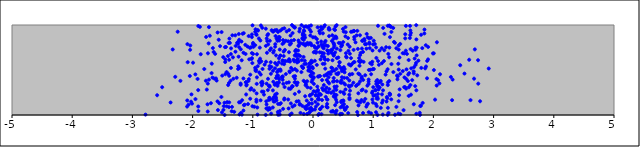
| Category | points |
|---|---|
| -0.11536172140889978 | 0.568 |
| 0.855340560258254 | 0.827 |
| 0.950376593433421 | 0.575 |
| -2.3654217001314772 | 0.139 |
| -0.9188085519647311 | 0.542 |
| 1.7925445229393047 | 0.104 |
| -0.3962743091543137 | 0.62 |
| 0.4827514001075617 | 0.516 |
| 2.0078775419024346 | 0.499 |
| 1.4906313874844983 | 0.687 |
| 0.229413308267703 | 0.089 |
| 1.299733297988685 | 0.174 |
| 0.9816180156502776 | 0.245 |
| 0.2290663632126302 | 0.389 |
| -1.5076938414311032 | 0.437 |
| -1.4354299441922942 | 0.477 |
| -0.493512844129369 | 0.347 |
| 0.11905940468164022 | 0.067 |
| -0.8036104463055107 | 0.56 |
| 0.8638495821112855 | 0.787 |
| 1.4173811658970017 | 0.016 |
| -1.695239620320689 | 0.131 |
| 0.6150114944620038 | 0.271 |
| 1.0090917165229216 | 0.826 |
| -0.3024135431161721 | 0.234 |
| -0.14083587335335235 | 0.888 |
| 1.3328299410901483 | 0.967 |
| -0.6283894157879573 | 0.227 |
| 1.8634917733704928 | 0.519 |
| -0.7447554629106268 | 0.058 |
| -0.1540404427648241 | 0.011 |
| -1.4905088370923636 | 0.642 |
| 0.3897195040649599 | 0.512 |
| 0.5305976975350095 | 0.056 |
| -1.6005800654296687 | 0.382 |
| -0.2729990534261706 | 0.15 |
| 0.3431523231334239 | 0.748 |
| -1.9068326993211508 | 0.277 |
| 0.8919075674239023 | 0.901 |
| 0.1297269422682934 | 0.226 |
| 1.0715161905887953 | 0.001 |
| 0.3144540680898693 | 0.823 |
| 0.09979983645594004 | 0.012 |
| 1.2055273532356274 | 0.448 |
| -2.0668161795774527 | 0.115 |
| 0.39399229132634517 | 0.318 |
| -1.637451032743872 | 0.404 |
| -1.2375084719498073 | 0.816 |
| 2.775246553585111 | 0.153 |
| -1.4567578296023571 | 0.618 |
| -0.05428214318970248 | 0.949 |
| -0.36726352069429513 | 0.129 |
| -0.6128458464107265 | 0.411 |
| 1.7052916728498895 | 0.725 |
| -0.2948752549511857 | 0.71 |
| 0.965690233938612 | 0.018 |
| -0.7446493147939428 | 0.784 |
| 0.09079423327969671 | 0.182 |
| -0.03739701206672574 | 0.795 |
| 0.6746534140835605 | 0.723 |
| 0.3076144245913257 | 0.719 |
| 0.17045094450077158 | 0.276 |
| -0.23729158090142377 | 0.771 |
| -0.5077637825059611 | 0.956 |
| 1.416662639511081 | 0.569 |
| 0.592947429764056 | 0.325 |
| -0.23954945366533575 | 0.767 |
| 1.5606696814219276 | 0.679 |
| 0.42346683080728376 | 0.468 |
| -1.1136013875597985 | 0.364 |
| -0.565676097437315 | 0.63 |
| -0.49818883439374595 | 0.832 |
| 0.1860750004171159 | 0.646 |
| -1.748240753640708 | 0.038 |
| -0.12287783613970404 | 0.33 |
| -0.8989563929704767 | 0.85 |
| -0.5523257429035029 | 0.045 |
| -1.611263220863023 | 0.406 |
| -0.8485586511439056 | 0.26 |
| 0.3425882755479801 | 0.848 |
| -0.9396232247876259 | 0.148 |
| 0.8108742677432819 | 0.424 |
| 0.524627232664681 | 0.474 |
| 1.4232181631729972 | 0.727 |
| 1.0499763745436805 | 0.372 |
| 0.5487009924934227 | 0.649 |
| 0.4729792911295574 | 0.385 |
| -0.2890499608500585 | 0.362 |
| 0.2506612368109682 | 0.464 |
| 0.5037959026280987 | 0.494 |
| 0.3947005808688955 | 0.141 |
| 0.24193768234937973 | 0.084 |
| 1.2782316736548003 | 0.865 |
| 0.6059959908328532 | 0.313 |
| -0.8704365943221051 | 0.163 |
| 1.8968619332324215 | 0.601 |
| 1.9109914056362323 | 0.618 |
| 1.0686088039595765 | 0.388 |
| 0.18840909640332093 | 0.437 |
| -0.47032570906938 | 0.598 |
| -1.3954701478435938 | 0.356 |
| 1.9118599101543197 | 0.757 |
| -1.1879964743984717 | 0.816 |
| 1.5187437734888452 | 0.418 |
| -0.913542339558246 | 0.938 |
| 0.12059355055421772 | 0.233 |
| -0.7031653131466147 | 0.586 |
| -0.7113163612693487 | 0.174 |
| -0.47535035608335985 | 0.184 |
| 0.132792798878695 | 0.977 |
| 1.7728537748569497 | 0.025 |
| -0.16952839372547324 | 0.858 |
| 0.8676345817348059 | 0.442 |
| 0.8686987402545592 | 0.179 |
| 0.029887238707689612 | 0.602 |
| -2.5056990865234745 | 0.309 |
| -0.7836495115470603 | 0.959 |
| 0.08001779421285615 | 0.119 |
| 1.6260380753652965 | 0.914 |
| 0.6396330073818568 | 0.329 |
| -0.3600729175718076 | 0.826 |
| 0.744756380228508 | 0.734 |
| -0.7340780543695571 | 0.167 |
| 0.3016331732355191 | 0.038 |
| -0.6020792045651033 | 0.237 |
| -0.5755650622314397 | 0.013 |
| -0.5346375320193157 | 0.131 |
| -0.5781360577551791 | 0.003 |
| -0.38238630235267923 | 0.003 |
| 0.30605923700554527 | 0.691 |
| -0.9378483628061289 | 0.89 |
| -0.33960009743820585 | 0.91 |
| 0.251572280414865 | 0.709 |
| -0.03411026291756869 | 0.926 |
| 1.2433906601676243 | 0.361 |
| -1.2017069204903628 | 0.35 |
| 0.2762548973997365 | 0.95 |
| -1.4337291907233363 | 0.096 |
| -1.025541668641777 | 0.297 |
| 0.2170081126896788 | 0.772 |
| -0.030941954401868976 | 0.477 |
| 1.5758301334003741 | 0.377 |
| 1.4505038069704428 | 0.009 |
| 1.0435942979064317 | 0.121 |
| -0.1687540861729424 | 0.896 |
| 0.24877031054929422 | 0.613 |
| -0.5765976322692907 | 0.414 |
| 0.30510692064172584 | 0.526 |
| -0.3961830401980091 | 0.944 |
| 0.014091697885460164 | 0.346 |
| -1.114114675839632 | 0.363 |
| -1.0658793220031528 | 0.399 |
| -0.29685529254652643 | 0.432 |
| 1.2423831419729092 | 0.332 |
| -1.7138373717556572 | 0.881 |
| -1.2075637460352322 | 0.142 |
| 0.1697603179341991 | 0.763 |
| -1.7750621634563988 | 0.867 |
| 0.16081281060495378 | 0.684 |
| 1.2142121458834314 | 0.753 |
| -0.30033399149122086 | 0.404 |
| -0.18675919740164204 | 0.54 |
| 1.068599934577989 | 0.318 |
| -1.169563646371384 | 0.903 |
| 1.188048088525715 | 0.901 |
| 0.07630100883736457 | 0.803 |
| -1.5191686653465917 | 0.921 |
| -0.7168326939125436 | 0.065 |
| 0.762205421555274 | 0.598 |
| 1.1841943182652317 | 0.72 |
| -0.38527386471606295 | 0.475 |
| -0.7801293024914244 | 0.592 |
| 0.43992175131592504 | 0.588 |
| -0.9483262064347695 | 0.506 |
| -1.6809006983068313 | 0.57 |
| 0.3410840524451544 | 0.799 |
| -0.3475941795915851 | 0.314 |
| 0.12043993059409264 | 0.941 |
| -0.0010775661164528216 | 0.864 |
| 1.159858633124756 | 0.161 |
| -0.07778317200620233 | 0.784 |
| -0.22171863763606936 | 0.115 |
| -0.7234123084638462 | 0.325 |
| -0.5900109014129526 | 0.343 |
| 0.7100493249022009 | 0.507 |
| -1.3399853714775336 | 0.885 |
| 2.0999988017895443 | 0.352 |
| 0.8859157572722189 | 0.093 |
| -0.1872240045514797 | 0.61 |
| 1.3616067807898649 | 0.003 |
| -0.926436412176475 | 0.084 |
| -0.6329039747510246 | 0.151 |
| -2.025089862399214 | 0.148 |
| 0.14186846218030968 | 0.693 |
| 0.6314989590358282 | 0.632 |
| -2.782197035765978 | 0.004 |
| 1.617250023375397 | 0.94 |
| 0.7453520345930746 | 0.001 |
| -0.7224381662267776 | 0.513 |
| 0.7506770451475742 | 0.149 |
| -1.26105847096213 | 0.802 |
| -1.5566468972765701 | 0.13 |
| -1.290793532050011 | 0.885 |
| -0.6145272738649448 | 0.188 |
| 1.5046721481286287 | 0.054 |
| -0.3727781296485544 | 0.882 |
| 2.594412146994955 | 0.614 |
| 1.704763624493527 | 0.748 |
| 0.5104430827013022 | 0.354 |
| 0.13626361804079767 | 0.816 |
| -0.4872339576017186 | 0.705 |
| -1.4005867504348668 | 0.8 |
| -0.9803197011202522 | 0.273 |
| -0.7473631678154362 | 0.402 |
| 0.08230927987148107 | 0.279 |
| -0.6073067386803315 | 0.163 |
| 1.4392643921897745 | 0.285 |
| 0.5817828718750224 | 0.855 |
| -2.088785532044323 | 0.162 |
| 0.47009565173205914 | 0.141 |
| 0.10487232763193344 | 0.931 |
| 0.6059229632457654 | 0.176 |
| -0.3953559682477099 | 0.607 |
| -0.5840585866607721 | 0.035 |
| -0.2023516367497864 | 0.796 |
| -0.2473099271779926 | 0.716 |
| -0.6504838690646979 | 0.2 |
| 0.3892223192122062 | 0.458 |
| 0.22298038963768363 | 0.451 |
| -0.02229430694150114 | 0.173 |
| 0.6565683091239727 | 0.927 |
| -1.4688115568275428 | 0 |
| -1.512750135015109 | 0.029 |
| -1.007504802920776 | 0.577 |
| -0.8788725234536638 | 0.626 |
| 0.36694394969540944 | 0.695 |
| 0.38844320138761823 | 0.854 |
| 0.9604991235594253 | 0.857 |
| -0.8651809811704272 | 0.994 |
| -1.0719606698743611 | 0.378 |
| 1.490995059616318 | 0.488 |
| 0.5391192750236335 | 0.977 |
| 0.1833069284363713 | 0.983 |
| -0.023484186584004085 | 0.064 |
| 0.11694834902641826 | 0.433 |
| -0.30612731346229793 | 0.107 |
| -1.2845074076749334 | 0.768 |
| 0.6768420461179687 | 0.934 |
| 2.0585454240274608 | 0.808 |
| -1.1014536545459883 | 0.337 |
| 0.5183714299874636 | 0.235 |
| 0.9247170022693014 | 0.394 |
| 0.14067870197243693 | 0.01 |
| 0.35171000761357885 | 0.952 |
| 1.080419576465359 | 0.359 |
| -0.11709091770071112 | 0.985 |
| -0.7203023522263496 | 0.544 |
| -0.3741763924668007 | 0.29 |
| 1.656511896463428 | 0.714 |
| 1.1415319353882865 | 0.742 |
| -1.0423209250086733 | 0.448 |
| -0.6524840818558477 | 0.15 |
| 1.7994814076327676 | 0.523 |
| 1.548465812594829 | 0.402 |
| -1.1481538555867585 | 0.109 |
| 0.5406340550551798 | 0.066 |
| 0.48050951699995625 | 0.773 |
| -0.4382334027787351 | 0.357 |
| -0.9211464407185934 | 0.005 |
| -0.0263919390819094 | 0.603 |
| -0.5045111716344977 | 0.392 |
| -2.0186524783573256 | 0.229 |
| 0.4204928447648051 | 0.639 |
| -1.388658668636567 | 0.849 |
| 0.1539076758545832 | 0.958 |
| -2.0915248222596303 | 0.094 |
| -0.6679551337449485 | 0.932 |
| -0.229264725583044 | 0.804 |
| 0.08784627678160906 | 0.208 |
| -0.5379250191997764 | 0.492 |
| -0.30950341237586976 | 0.596 |
| -0.9352921207063618 | 0.346 |
| -1.2213135346852866 | 0.006 |
| 1.2722094890579054 | 0.239 |
| 0.7784297492674375 | 0.595 |
| -0.30496251918037665 | 0.364 |
| -1.0048237712355022 | 0.996 |
| -0.7748671516727761 | 0.073 |
| -1.1109310553670424 | 0.228 |
| -0.453040925444677 | 0.599 |
| -0.6003797792095931 | 0.434 |
| -1.0483909218246126 | 0.747 |
| -1.1804244765069933 | 0.005 |
| -0.9959175980804593 | 0.679 |
| 0.0463971907787073 | 0.216 |
| 0.6263307141674694 | 0.55 |
| -0.5955135066051076 | 0.477 |
| 0.2116414771483779 | 0.202 |
| 1.3611083976268388 | 0.803 |
| 0.5681245441007832 | 0.411 |
| 0.390131927199052 | 0.048 |
| 0.03940648712583883 | 0.146 |
| 1.1436149746736692 | 0.575 |
| 0.7825536855266737 | 0.665 |
| 2.110423490457425 | 0.453 |
| -1.6842401724500746 | 0.465 |
| -0.4011134363859785 | 0.363 |
| 0.7275403609990683 | 0.159 |
| -0.1284987495850496 | 0.773 |
| 1.8156209138480799 | 0.743 |
| 0.3965196217289355 | 0.632 |
| -0.054747552792562715 | 0.797 |
| -0.7859801171873233 | 0.001 |
| -0.07615237245944506 | 0.533 |
| 0.1917015314435968 | 0.569 |
| 1.1660191385530858 | 0.967 |
| -1.0158834800022483 | 0.865 |
| 0.3320561678371856 | 0.372 |
| 0.6127902397359133 | 0.681 |
| 1.2648826233450974 | 0.642 |
| -0.8426639210694651 | 0.969 |
| 0.22622288612182562 | 0.094 |
| 0.3675639213563029 | 0.871 |
| 0.7736062601519222 | 0.451 |
| 0.8316001963072202 | 0.022 |
| 0.5149404872833472 | 0.119 |
| -0.03247180763823643 | 0.995 |
| -0.5471257092788351 | 0.655 |
| 1.6743142630415084 | 0.119 |
| 0.9535779161243463 | 0.502 |
| -0.9959999883881725 | 0.787 |
| 0.38924492929170196 | 0.222 |
| -1.0263948069000008 | 0.753 |
| 0.4975210165984949 | 0.956 |
| 0.05270639221159534 | 0.703 |
| 1.2663723737750843 | 0.377 |
| -0.7196548797380586 | 0.314 |
| 0.5471039523505254 | 0.686 |
| 1.0797840839122435 | 0.991 |
| 1.3454779279714097 | 0.812 |
| 0.2592667162076898 | 0.419 |
| 0.06307933076282346 | 0.557 |
| 0.33932737258167656 | 0.265 |
| 1.2772915616753266 | 0.223 |
| 0.38702956508374786 | 0.28 |
| 0.8402063499907557 | 0.59 |
| 0.3207656716628744 | 0.886 |
| 1.0775950987100673 | 0.18 |
| 1.3352503307788863 | 0.477 |
| -0.5493164126006684 | 0.122 |
| -1.1560409992907204 | 0.049 |
| -0.10355574027395509 | 0.16 |
| 0.2629488208993118 | 0.951 |
| -0.06946269652812198 | 0.501 |
| -1.2233262854022886 | 0.521 |
| 0.06560530095187911 | 0.745 |
| 0.2964587129243901 | 0.719 |
| -0.21310307465277845 | 0.655 |
| 0.3285980163200657 | 0.045 |
| 0.037190433861130856 | 0.746 |
| 1.0371593073788237 | 0.278 |
| 0.9307433821157209 | 0.852 |
| 1.712183306074163 | 0.579 |
| 0.45976560249810383 | 0.012 |
| 0.34364197466534296 | 0.667 |
| 1.7216973647528793 | 0.662 |
| 1.7233966883043284 | 0.748 |
| -0.5081189983611347 | 0.417 |
| -0.6137920522262279 | 0.662 |
| 0.5628158511099839 | 0.09 |
| -1.3082987141586369 | 0.035 |
| 0.04774874919881267 | 0.093 |
| -1.584710282613969 | 0.917 |
| 0.8013012171498621 | 0.601 |
| 1.0103243693612658 | 0.511 |
| -0.7203377082463573 | 0.188 |
| 1.2221799088867122 | 0.15 |
| -0.8830752134224937 | 0.748 |
| -0.26966982877818246 | 0.608 |
| -0.21486395152850157 | 0.121 |
| -1.5217209005693704 | 0.2 |
| -1.086955911863333 | 0.761 |
| 1.251136556294024 | 0.679 |
| -0.17146064007284423 | 0.854 |
| -0.9594586614916656 | 0.925 |
| -0.5981435393468981 | 0.357 |
| 0.8159963838507025 | 0.825 |
| -0.2637879880446796 | 0.584 |
| 1.268116693720283 | 0.994 |
| 0.453935980028934 | 0.8 |
| -0.23721389856126507 | 0.666 |
| 0.6085466197770506 | 0.759 |
| 0.2252457551476148 | 0.305 |
| 0.534258586671398 | 0.338 |
| -2.009864551854193 | 0.126 |
| -1.455823783193381 | 0.453 |
| 1.592489708149638 | 0.309 |
| -0.354509258586841 | 0.016 |
| 0.7529418990214571 | 0.46 |
| -0.6272981569020093 | 0.344 |
| -1.992432757887201 | 0.581 |
| 1.046918932857892 | 0.03 |
| 0.16479513129705925 | 0.908 |
| -0.05185626003833921 | 0.214 |
| -0.2527428808923933 | 0.623 |
| 0.47085931693803484 | 0.155 |
| -0.5669963379055805 | 0.585 |
| 1.083868207688834 | 0.321 |
| 0.07129282460497599 | 0.316 |
| 0.9884330623887312 | 0.261 |
| 0.19164651423338874 | 0.624 |
| -0.36538001816526045 | 0.796 |
| -0.39105787822396465 | 0.485 |
| 0.5037342663623692 | 0.253 |
| -0.8679313618265656 | 0.45 |
| 1.0010256413895933 | 0.309 |
| -1.1559199689272361 | 0.406 |
| 0.9280076888386679 | 0.501 |
| -0.9892003122949147 | 0.757 |
| -0.03339264966832012 | 0.483 |
| 0.14103160623766975 | 0.782 |
| -0.16639442145890104 | 0.521 |
| -1.3615385076817583 | 0.74 |
| 0.08081928775044567 | 0.265 |
| 0.7724258521249867 | 0.546 |
| 0.9776185092851 | 0.563 |
| 1.7168907126620674 | 0.274 |
| 0.04841394526374643 | 0.221 |
| 0.16187877849748755 | 0.569 |
| -1.7291246057034462 | 0.976 |
| 0.09900729850810386 | 0.173 |
| 0.8460715282775588 | 0.149 |
| 0.39247758151253365 | 0.998 |
| -0.564515357460726 | 0.362 |
| -0.010341837045308111 | 0.389 |
| 0.9419105775598755 | 0.743 |
| -1.1204095797291176 | 0.678 |
| -0.2702713718364178 | 0.333 |
| 1.4086904975072274 | 0.429 |
| -0.758348708795479 | 0.886 |
| -0.6277086980423814 | 0.577 |
| 0.25142789068364735 | 0.367 |
| -0.10829947980557275 | 0.099 |
| -1.904515596326843 | 0.989 |
| 0.36549944978959115 | 0.945 |
| 1.2392610701917688 | 0.002 |
| -0.03423361012660209 | 0.439 |
| -1.2000569439839115 | 0.729 |
| 0.7341859626554967 | 0.034 |
| -1.7634718877416136 | 0.282 |
| -1.1843896772681815 | 0.608 |
| 2.919437984541201 | 0.516 |
| -1.0431210386977687 | 0.181 |
| -0.3152542848266915 | 0.833 |
| -1.1965521627736733 | 0.023 |
| 1.698146665454404 | 0.321 |
| -1.021571179846335 | 0.622 |
| -0.33985073207662 | 0.093 |
| 2.741629354882745 | 0.609 |
| 1.3036493529934434 | 0.566 |
| 1.8217468574388036 | 0.134 |
| 1.125291544195374 | 0.378 |
| -1.3931775516994955 | 0.436 |
| 2.2900255733514427 | 0.423 |
| -1.3919445069140757 | 0.14 |
| -0.8224879234644158 | 0.259 |
| -0.16830806067639337 | 0.906 |
| -2.0815104528119437 | 0.587 |
| -0.36300911038704164 | 0.524 |
| -0.011793557524685916 | 0.235 |
| 0.4823249223683934 | 0.154 |
| -0.12930551319401218 | 0.366 |
| 0.15109411862853506 | 0.388 |
| -1.329879552279209 | 0.641 |
| -1.364861582565461 | 0.677 |
| -2.3301307672597487 | 0.728 |
| 0.23454510033796705 | 0.123 |
| -0.2982860411561683 | 0.51 |
| 0.5969710954314804 | 0.562 |
| -0.4056435777550984 | 0.073 |
| -0.33951538786261093 | 0.501 |
| 0.19660099507733797 | 0.997 |
| 0.37445167660823575 | 0.034 |
| 0.6086035005451249 | 0.45 |
| 0.48033719059991586 | 0.419 |
| -0.26713385585054983 | 0.493 |
| -0.15433500801376354 | 0.786 |
| 1.3021286721976981 | 0.923 |
| 1.0265282660707973 | 0.789 |
| 0.17667908704046908 | 0.741 |
| -0.9493570647936442 | 0.488 |
| -0.044868000717842804 | 0.039 |
| -0.4766563848432739 | 0.963 |
| -0.14356225556126923 | 0.567 |
| 0.373763261070839 | 0.982 |
| 0.9355605002962823 | 0.804 |
| -0.6036320825165973 | 0.944 |
| -0.7834568504152744 | 0.768 |
| 0.3783396119510094 | 0.016 |
| -1.4254461286004716 | 0.143 |
| 2.07840736737106 | 0.386 |
| 1.2421904173562126 | 0.991 |
| 1.6886584315431579 | 0.627 |
| 0.12519938994228585 | 0.618 |
| 1.5284572452651535 | 0.309 |
| -0.28489343472105233 | 0.723 |
| 0.673040499379594 | 0.583 |
| 0.7911013445818602 | 0.69 |
| 0.04945135820795077 | 0.692 |
| 0.43249545114444476 | 0.545 |
| 0.5020075536000457 | 0.81 |
| 0.8067919110932307 | 0.408 |
| -0.41267188318889936 | 0.6 |
| 1.3849728826427228 | 0.09 |
| 0.043591784246071796 | 0.259 |
| 0.4887920353385651 | 0.103 |
| 0.46763058414652736 | 0.761 |
| 2.675464532613539 | 0.404 |
| -1.014018137050921 | 0.895 |
| -0.40078933123831284 | 0.294 |
| -2.2881270469632278 | 0.424 |
| -0.22734217392392697 | 0.928 |
| -1.0155521509508283 | 0.688 |
| 0.5131632206406547 | 0.081 |
| -0.06114685574665302 | 0.07 |
| -1.3226385818910416 | 0.402 |
| 0.9070462557406076 | 0.864 |
| -1.1074285381322237 | 0.328 |
| -0.7171453290678684 | 0.825 |
| 1.0529004201056837 | 0.634 |
| -0.16648212296047937 | 0.854 |
| -0.5584751697795767 | 0.827 |
| 0.7569361906478527 | 0.346 |
| -0.021749235656324473 | 0.368 |
| -0.874233325214389 | 0.828 |
| -1.0141476400228395 | 0.631 |
| -0.05446544030533129 | 0.521 |
| -1.2330860753459492 | 0.9 |
| -0.9308952076122772 | 0.675 |
| 0.46474153929774165 | 0.52 |
| -0.46714385735860553 | 0.723 |
| 0.9864756458576815 | 0.172 |
| -0.13047619671442323 | 0.208 |
| 0.26843654725426536 | 0.351 |
| -0.8629604944047387 | 0.36 |
| 0.4500097104258769 | 0.007 |
| -0.09112512496905723 | 0.308 |
| 0.42766026801670165 | 0.801 |
| -0.09632602091854459 | 0.375 |
| -0.5426418911347914 | 0.505 |
| -0.007568324541118443 | 0.056 |
| 0.45846699683115943 | 0.085 |
| -0.47914594912853925 | 0.565 |
| 0.08317492784686209 | 0.427 |
| -0.3500770298395217 | 0.999 |
| -0.10876700891333613 | 0.07 |
| -1.1553553579359637 | 0.692 |
| -0.41121099857765575 | 0.819 |
| 2.0517263621956996 | 0.399 |
| 0.8513994324453105 | 0.844 |
| -0.6662802420396439 | 0.273 |
| 0.9886378719259374 | 0.717 |
| 0.8301383119983097 | 0.701 |
| -0.15511907109049172 | 0.38 |
| -0.034508426846111995 | 0.081 |
| 0.2623973134961757 | 0.968 |
| -1.8650015015286936 | 0.675 |
| 1.6083038235568683 | 0.855 |
| -0.6217327214184074 | 0.877 |
| 2.3107481826142475 | 0.165 |
| 0.7822029452195274 | 0.587 |
| 0.20833292476114895 | 0.823 |
| 1.8941772886967305 | 0.408 |
| 0.6869409754781284 | 0.84 |
| -0.6992378604457006 | 0.458 |
| -1.0588847844961862 | 0.619 |
| 0.47753823882216917 | 0.779 |
| 0.8338834980451093 | 0.39 |
| 2.027506777907117 | 0.171 |
| 0.3434507199315293 | 0.411 |
| 0.24754542294949466 | 0.766 |
| 0.3526626741287435 | 0.21 |
| -1.7283549467636004 | 0.393 |
| -0.5175177916903344 | 0.423 |
| 1.9923455608947034 | 0.684 |
| 0.5596475362929487 | 0.64 |
| 0.2366343893918863 | 0.719 |
| 0.9239198162909643 | 0.371 |
| -0.7701551814405629 | 0.348 |
| -0.45147223934024083 | 0.455 |
| 0.6027526805832277 | 0.226 |
| -0.0759482595798211 | 0.115 |
| -1.0796056063812927 | 0.121 |
| 1.286689240708422 | 0.983 |
| -0.20767138400006857 | 0.023 |
| -0.8383971491046385 | 0.511 |
| 1.2807706018614144 | 0.232 |
| -0.23174054962934765 | 0.259 |
| 0.17338716317308656 | 0.774 |
| -0.16647085673390016 | 0.528 |
| 1.0388766753076322 | 0.274 |
| -0.6053053210093484 | 0.85 |
| 1.7782907886254886 | 0.001 |
| -1.7792817494375486 | 0.381 |
| 1.5327518420629813 | 0.897 |
| 0.007928163521452092 | 0.41 |
| -0.16827776984072162 | 0.888 |
| 1.7044882611907184 | 0.557 |
| -0.6902589438801616 | 0.534 |
| 0.6710188591999717 | 0.359 |
| -0.5984027272113099 | 0.558 |
| 1.2266051836831284 | 0.2 |
| 1.1520409235474052 | 0.339 |
| -2.58890098050699 | 0.22 |
| -1.6692115819903046 | 0.415 |
| 1.1459470488020767 | 0.137 |
| -1.0055817403414924 | 0.098 |
| -0.32566576128659896 | 0.983 |
| -1.6494828216805075 | 0.7 |
| -0.32395387201994996 | 0.614 |
| 0.45390901224851454 | 0.721 |
| -0.06658183789265593 | 0.985 |
| 2.6168187225919226 | 0.165 |
| 0.32219201295844613 | 0.519 |
| 0.6838341598300879 | 0.933 |
| -0.05609990931079967 | 0.569 |
| -1.5865731208677296 | 0.152 |
| -2.039023688635067 | 0.772 |
| -0.814345836678112 | 0.227 |
| 1.6218829421866516 | 0.732 |
| -1.245565928742269 | 0.792 |
| -2.2476688988484814 | 0.925 |
| 1.1457789658281525 | 0.229 |
| 0.22698735972325323 | 0.443 |
| 0.8877059949166703 | 0.737 |
| 1.3956218205732744 | 0.438 |
| -1.457675543989711 | 0.588 |
| 0.2706928579651917 | 0.288 |
| 0.3831905259926973 | 0.17 |
| -0.14707226755625769 | 0.979 |
| -0.6589812445126535 | 0.369 |
| 0.8975674534421492 | 0.116 |
| 0.3546977460666394 | 0.77 |
| -0.13691966980948056 | 0.604 |
| -0.07673073129385788 | 0.493 |
| -0.931846438710993 | 0.418 |
| 0.7155433534717854 | 0.324 |
| -1.6254876619319187 | 0.679 |
| -0.34084338852732454 | 0.318 |
| 0.003628988398323152 | 0.462 |
| 0.5775756832028547 | 0.784 |
| 1.1072839148599396 | 0.305 |
| -0.9195973994991693 | 0.943 |
| 0.35765867079881897 | 0.316 |
| -0.1216260230879822 | 0.088 |
| -0.013088209813675533 | 0.588 |
| -1.4463561814770767 | 0.756 |
| 1.2336094423400858 | 0.185 |
| -0.8505297734199164 | 0.329 |
| 0.2902074303633597 | 0.453 |
| 1.7959180225849591 | 0.891 |
| 0.3679498263283971 | 0.109 |
| -0.38476207136788787 | 0.783 |
| -0.2421589997945537 | 0.828 |
| 1.5890243439617597 | 0.611 |
| -0.045334506636880434 | 0.883 |
| 0.8246665278992849 | 0.282 |
| -1.3681839407556513 | 0.381 |
| -2.0463141430268585 | 0.433 |
| 0.7811166691184965 | 0.885 |
| -1.3501823726575664 | 0.042 |
| -0.3987547419362505 | 0.697 |
| -1.6634819090635586 | 0.744 |
| 1.8496778348938374 | 0.906 |
| 1.0045664641588745 | 0.214 |
| -0.630637665649596 | 0.518 |
| -0.6985870397071245 | 0.74 |
| 0.1808458914197928 | 0.685 |
| 0.22562226385907103 | 0.256 |
| -0.1574953158957575 | 0.645 |
| -0.7515063030188429 | 0.076 |
| 0.5444845600825197 | 0.92 |
| 1.0871985112201115 | 0.283 |
| -0.5817728814510126 | 0.923 |
| 0.5041034649914042 | 0.154 |
| -1.9541664571600883 | 0.451 |
| -2.0859466742477375 | 0.787 |
| -1.2407143844349164 | 0.541 |
| 0.20428661215690358 | 0.614 |
| -0.5402892138481219 | 0.938 |
| -0.3225284183158106 | 0.428 |
| -0.13373773861797478 | 0.084 |
| 0.31431358536558296 | 0.722 |
| -0.4785342524089282 | 0.171 |
| 0.7534033349360829 | 0.241 |
| -0.2550445310435734 | 0.359 |
| -0.23991592795651862 | 0.154 |
| -0.5542269036211325 | 0.865 |
| 1.7830634131284322 | 0.099 |
| -0.04875678019112151 | 0.221 |
| 1.8735460056927549 | 0.775 |
| 0.10150622728211456 | 0.233 |
| 0.2530267297494895 | 0.683 |
| -0.21973406632409542 | 0.959 |
| 0.36695271003896224 | 0.299 |
| 0.3116493368720077 | 0.484 |
| 0.35618572826272654 | 0.231 |
| -0.017377146478690264 | 0.127 |
| -0.3040612838817296 | 0.971 |
| -0.01176108020563671 | 0.533 |
| -0.052691766265476225 | 0.577 |
| 1.4220524633125304 | 0.153 |
| -1.3932468370798379 | 0.614 |
| 1.5148935333423177 | 0.31 |
| -1.7451500488745024 | 0.685 |
| 1.163468787206991 | 0.274 |
| 1.1061427785460616 | 0.715 |
| 2.5161406946742453 | 0.46 |
| 0.5885549170003213 | 0.713 |
| 0.09743426250238407 | 0.429 |
| 0.11175658619980133 | 0.697 |
| 0.5393398982991799 | 0.284 |
| -0.09155580090452897 | 0.801 |
| -0.48746627849976676 | 0.655 |
| 0.4116460128017927 | 0.453 |
| 0.39495468505520037 | 0.738 |
| 1.6737300312871461 | 0.462 |
| -1.4092961516888316 | 0.332 |
| 0.8801359192856983 | 0.263 |
| 0.5209410811508484 | 0.413 |
| 1.2543259164623652 | 0.023 |
| -0.9603547919155551 | 0.776 |
| -1.3966014241188018 | 0.088 |
| 0.11878610660145661 | 0.065 |
| -1.2675007925358157 | 0.414 |
| -0.059782953685821205 | 0.542 |
| 0.7277969825928476 | 0.332 |
| 1.5459382904577739 | 0.294 |
| -0.7651411732930731 | 0.691 |
| 0.9125655901658831 | 0.125 |
| 0.925949145550006 | 0.03 |
| -1.1768771591664722 | 0.164 |
| -0.6314863375221345 | 0.941 |
| -0.17562627196626313 | 0.847 |
| -0.7709296107002785 | 0.117 |
| -1.2268678537213091 | 0.753 |
| -0.4718401402645034 | 0.311 |
| -0.16142640695709165 | 0.793 |
| 0.2545642984531735 | 0.252 |
| -0.27314963565910144 | 0.654 |
| 1.0581403662784874 | 0.099 |
| 0.9914300517086545 | 0.509 |
| 0.5102283849089249 | 0.927 |
| 1.4026179472318159 | 0.397 |
| -0.11662262873085094 | 0.341 |
| -0.5677257292211637 | 0.843 |
| 0.7815448862206864 | 0.373 |
| 0.32378223328475375 | 0.608 |
| -0.001574398151300116 | 0.519 |
| 0.011442040768548267 | 0.265 |
| -1.3454919615674088 | 0.09 |
| 1.618153629274306 | 0.333 |
| 0.032616932670316956 | 0.061 |
| -0.5520670698904846 | 0.006 |
| -1.041490694295284 | 0.282 |
| -0.9407871951168829 | 0.17 |
| 1.0336286546540032 | 0.22 |
| -2.0411387846607294 | 0.724 |
| 1.437127303423794 | 0.639 |
| 2.00674447039788 | 0.685 |
| -0.032003587447142934 | 0.577 |
| -0.5523163405871374 | 0.727 |
| 0.30091873050636586 | 0.247 |
| 0.4681855864857143 | 0.357 |
| 2.4455872680007555 | 0.553 |
| -0.7226588228508533 | 0.077 |
| 0.6026959997678984 | 0.383 |
| -1.3807208479411823 | 0.802 |
| -0.5797345240713376 | 0.123 |
| 0.7665565204951816 | 0.632 |
| 0.013277390861048843 | 0.697 |
| -0.23930639989205726 | 0.595 |
| 0.7250855428656928 | 0.885 |
| -0.5026166401726186 | 0.6 |
| -0.6680359081558622 | 0.176 |
| -0.03992890134202565 | 0.3 |
| 1.5985148845482309 | 0.465 |
| -0.9547837914806916 | 0.952 |
| 0.5251848546263265 | 0.511 |
| 0.14655845729582584 | 0.651 |
| 1.0520477000175816 | 0.344 |
| -0.08994218474226923 | 0.976 |
| -0.7503338877641168 | 0.277 |
| -0.8890092818095452 | 0.58 |
| -0.5805076729507652 | 0.438 |
| 1.5420828677018559 | 0.714 |
| -0.4359177581693148 | 0.929 |
| 1.178045268112557 | 0.599 |
| -0.5611298654012025 | 0.497 |
| 0.06366673524335376 | 0.844 |
| 0.9387199369829657 | 0.79 |
| -0.8438839505885385 | 0.37 |
| 0.3444641691930972 | 0.66 |
| -0.776295227711862 | 0.152 |
| 1.4484574492039055 | 0.79 |
| -1.470288845357656 | 0.136 |
| 1.7171367999751785 | 0.013 |
| 0.454814250660176 | 0.366 |
| 1.0943275222994338 | 0.558 |
| 1.4226147261789803 | 0.772 |
| -1.4822078327861536 | 0.098 |
| -0.7452893349775351 | 0.898 |
| 0.08189096535400964 | 0.175 |
| 0.1802689520923053 | 0.332 |
| 1.2435649517230658 | 0.08 |
| -0.4516833623314689 | 0.825 |
| 0.2673564160643096 | 0.876 |
| 1.2682817696376585 | 0.749 |
| -0.936419157818742 | 0.24 |
| 0.7066912505919385 | 0.807 |
| 0.8261115662452179 | 0.823 |
| 2.7449594920258384 | 0.348 |
| -1.201616485847472 | 0.336 |
| 1.450139398386555 | 0.457 |
| 0.6526955634198233 | 0.456 |
| -0.6352806330258023 | 0.336 |
| 0.16153949470008833 | 0.754 |
| 1.627250303134267 | 0.226 |
| -0.506264033088315 | 0.79 |
| -1.226276507779068 | 0.836 |
| -0.5145308044023951 | 0.571 |
| 1.7312747677728249 | 0.441 |
| -0.7318944518822201 | 0.323 |
| -1.363192365940792 | 0.523 |
| -0.6868508869355354 | 0.941 |
| 0.53850214779869 | 0.873 |
| -0.629740672652014 | 0.759 |
| 0.38241938060242564 | 0.869 |
| -1.4874983566954318 | 0.057 |
| -0.5769957516819595 | 0.499 |
| 0.1527476989226173 | 0.091 |
| 1.42969761597422 | 0.22 |
| -0.11513346606852615 | 0.068 |
| -1.2880134914210846 | 0.703 |
| 0.3703063512378346 | 0.195 |
| 0.6887884385299214 | 0.589 |
| 0.5121455161815209 | 0.532 |
| 0.6137672031316725 | 0.449 |
| 0.8128693556610198 | 0.738 |
| -0.7251698642243127 | 0.191 |
| 0.4559813569600699 | 0.257 |
| 0.20306004468039784 | 0.515 |
| 1.532014993122135 | 0.851 |
| 1.8514880994345617 | 0.949 |
| -1.1506619866249528 | 0.909 |
| 0.883619069922057 | 0.787 |
| 0.09494741406358553 | 0.763 |
| 1.5814077889269473 | 0.45 |
| 1.0772620339334962 | 0.234 |
| -0.5889550108374095 | 0.324 |
| -0.0640084475517515 | 0.131 |
| -0.7686187570082073 | 0.85 |
| -1.1241800906052015 | 0.779 |
| 1.057556681996675 | 0.183 |
| -0.667285476937054 | 0.084 |
| -1.9066531302306142 | 0.094 |
| -0.9957246367291104 | 0.801 |
| 1.0691061449659722 | 0.196 |
| 0.6424350056018122 | 0.564 |
| -0.04308782984843873 | 0.438 |
| 0.5852274210568531 | 0.021 |
| -0.30375824416094854 | 0.975 |
| -0.13134754750140232 | 0.861 |
| -0.3029931462170943 | 0.662 |
| 0.020660285610166973 | 0.766 |
| 0.4421987081350398 | 0.584 |
| 1.1138224710850313 | 0.366 |
| 0.22982008733824077 | 0.174 |
| 1.678112540231555 | 0.531 |
| 1.5901228822940148 | 0.212 |
| -0.3815233638579292 | 0.594 |
| -0.14607834587973922 | 0.932 |
| -0.41244845458630763 | 0.172 |
| -0.7166914116573029 | 0.72 |
| -1.4085179826841694 | 0.458 |
| 2.319306616009733 | 0.393 |
| -1.9527183702987898 | 0.177 |
| -0.6603671177889927 | 0.926 |
| 2.0547556785267833 | 0.327 |
| 1.5534595270983171 | 0.507 |
| -0.027277935602619152 | 0.426 |
| 1.6159110547293354 | 0.888 |
| 0.1993996586559863 | 0.281 |
| -0.48368516075459134 | 0.804 |
| -1.9173321203300153 | 0.4 |
| 0.9850408112272557 | 0.591 |
| 1.7150860962962398 | 0.998 |
| -1.4618622825119978 | 0.754 |
| 1.8774395893975635 | 0.538 |
| 1.4243038067375142 | 0.505 |
| -1.5436720122825411 | 0.765 |
| -0.7591991300971435 | 0.821 |
| 0.03570016110258489 | 0.863 |
| -0.8935866673450779 | 0.473 |
| 0.11529309046234548 | 0.908 |
| 0.6852220762530772 | 0.867 |
| -1.414218805767744 | 0.655 |
| -1.0684083029439542 | 0.877 |
| 2.6884541800107193 | 0.729 |
| 0.998625690182048 | 0.784 |
| -0.6644101802916138 | 0.491 |
| -0.19085482156054656 | 0.998 |
| 0.631539160137689 | 0.925 |
| 0.35348507482412206 | 0.494 |
| -0.5059385076049265 | 0.607 |
| -0.024391838826928414 | 0.775 |
| 0.330856401159461 | 0.038 |
| -0.621126600521464 | 0.2 |
| 1.1597803338859949 | 0.005 |
| -0.09642609115486334 | 0.012 |
| 0.1539319408484534 | 0.298 |
| -0.19296140104034976 | 0.477 |
| -0.6950182880820845 | 0.015 |
| 0.3992462875170011 | 0.376 |
| 1.2397101357134463 | 0.508 |
| -0.49663731438499514 | 0.069 |
| -1.2443524794946557 | 0.512 |
| 1.220654671963306 | 0.484 |
| -0.898514751145779 | 0.602 |
| 1.6727522655707237 | 0.485 |
| 0.7363455755964594 | 0.935 |
| 1.291600309054071 | 0.98 |
| 0.9654286242063295 | 0.453 |
| 0.34810658594584787 | 0.786 |
| 0.012353444717782658 | 0.42 |
| -1.566344806077213 | 0.836 |
| 0.19295948764090998 | 0.805 |
| -0.0658742540786541 | 0.022 |
| -1.7468573660767301 | 0.349 |
| -0.9441764651876721 | 0.898 |
| 1.0806811571335757 | 0.599 |
| -1.2361299881507168 | 0.648 |
| 1.612403946606352 | 0.99 |
| -0.9748733225749957 | 0.092 |
| -0.5027845532535933 | 0.43 |
| 1.1259536275405395 | 0.08 |
| 0.35136314123552204 | 0.375 |
| 0.08771037741710064 | 0.003 |
| 1.3843661338738338 | 0.742 |
| 0.24012881380059348 | 0.171 |
| 0.47950585507088306 | 0.488 |
| 0.9029313734484745 | 0.326 |
| -0.8364637694902424 | 0.352 |
| 1.7173731638045027 | 0.84 |
| 0.07710841922316902 | 0.975 |
| -0.27752567764152314 | 0.678 |
| 0.27187094669012524 | 0.472 |
| -0.3427644594084791 | 0.32 |
| 0.34246131264093194 | 0.678 |
| -1.752297625710007 | 0.119 |
| -1.2283814673247493 | 0.141 |
| -1.7329181318096998 | 0.796 |
| 0.8054950514711674 | 0.166 |
| 0.34574075619369715 | 0.205 |
| -0.9604950684578233 | 0.525 |
| 1.6312104551320878 | 0.518 |
| -1.133602425640822 | 0.114 |
| -2.2020433448713033 | 0.379 |
| -0.17629506345123236 | 0.101 |
| -0.1137568441926744 | 0.788 |
| 0.7557567134506948 | 0.107 |
| -0.8582539478436582 | 0.596 |
| 0.9967219042246969 | 0.138 |
| -1.579793314884962 | 0.055 |
| -0.9550781594379458 | 0.499 |
| -0.6265455561996234 | 0.787 |
| -0.5684995107401516 | 0.867 |
| -1.904097449010071 | 0.044 |
| 0.7853243624984048 | 0.139 |
| 0.8071086940319994 | 0.274 |
| -0.6496533295217004 | 0.715 |
| 1.515538846239143 | 0.684 |
| -1.8057841781486932 | 0.511 |
| 1.0478592980705255 | 0.751 |
| -0.1544902693173249 | 0.835 |
| -0.6601431855775806 | 0.695 |
| 1.6482254618819034 | 0.388 |
| 0.6061351403407267 | 0.19 |
| -0.5413522222000555 | 0.661 |
| 0.027290599676550897 | 0.701 |
| 1.5425864016542032 | 0.99 |
| 0.9235434262485134 | 0.345 |
| 0.5029403627746785 | 0.162 |
| 0.15064519953191713 | 0.166 |
| -1.8784083978130273 | 0.98 |
| -0.5605603966147594 | 0.397 |
| -0.15162923835893682 | 0.939 |
| 1.7508345574495623 | 0.604 |
| 0.48405655874152664 | 0.012 |
| -0.5902475907047933 | 0.824 |